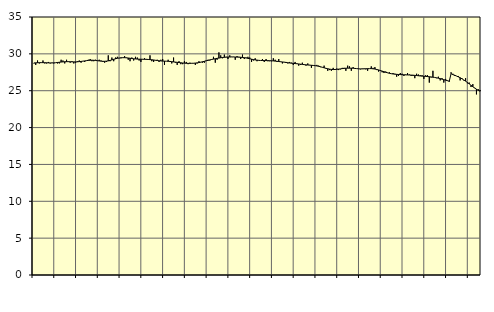
| Category | Piggar | Series 1 |
|---|---|---|
| nan | 28.7 | 28.77 |
| 1.0 | 28.5 | 28.78 |
| 1.0 | 29.1 | 28.8 |
| 1.0 | 28.7 | 28.8 |
| 1.0 | 28.8 | 28.81 |
| 1.0 | 29.1 | 28.81 |
| 1.0 | 28.7 | 28.8 |
| 1.0 | 28.7 | 28.79 |
| 1.0 | 28.9 | 28.78 |
| 1.0 | 28.7 | 28.77 |
| 1.0 | 28.8 | 28.77 |
| 1.0 | 28.7 | 28.78 |
| nan | 28.8 | 28.8 |
| 2.0 | 28.7 | 28.83 |
| 2.0 | 28.7 | 28.86 |
| 2.0 | 29.2 | 28.89 |
| 2.0 | 29.1 | 28.91 |
| 2.0 | 28.7 | 28.93 |
| 2.0 | 29.2 | 28.94 |
| 2.0 | 28.9 | 28.94 |
| 2.0 | 28.8 | 28.93 |
| 2.0 | 29 | 28.92 |
| 2.0 | 28.7 | 28.91 |
| 2.0 | 28.8 | 28.91 |
| nan | 29 | 28.92 |
| 3.0 | 29.1 | 28.95 |
| 3.0 | 28.8 | 28.97 |
| 3.0 | 29 | 29.01 |
| 3.0 | 28.9 | 29.04 |
| 3.0 | 29.1 | 29.08 |
| 3.0 | 29.2 | 29.11 |
| 3.0 | 29.3 | 29.13 |
| 3.0 | 29 | 29.14 |
| 3.0 | 29 | 29.13 |
| 3.0 | 29.2 | 29.11 |
| 3.0 | 29.1 | 29.07 |
| nan | 29.2 | 29.04 |
| 4.0 | 29.1 | 29.01 |
| 4.0 | 28.9 | 28.99 |
| 4.0 | 28.8 | 28.99 |
| 4.0 | 28.9 | 29.01 |
| 4.0 | 29.8 | 29.05 |
| 4.0 | 29 | 29.11 |
| 4.0 | 29.5 | 29.18 |
| 4.0 | 29 | 29.26 |
| 4.0 | 29.5 | 29.33 |
| 4.0 | 29.6 | 29.4 |
| 4.0 | 29.4 | 29.44 |
| nan | 29.4 | 29.47 |
| 5.0 | 29.5 | 29.48 |
| 5.0 | 29.7 | 29.48 |
| 5.0 | 29.5 | 29.46 |
| 5.0 | 29.2 | 29.44 |
| 5.0 | 29 | 29.4 |
| 5.0 | 29.5 | 29.37 |
| 5.0 | 29.1 | 29.33 |
| 5.0 | 29.6 | 29.31 |
| 5.0 | 29.5 | 29.29 |
| 5.0 | 29.1 | 29.28 |
| 5.0 | 28.9 | 29.27 |
| nan | 29.3 | 29.27 |
| 6.0 | 29.4 | 29.26 |
| 6.0 | 29.2 | 29.26 |
| 6.0 | 29.2 | 29.24 |
| 6.0 | 29.8 | 29.22 |
| 6.0 | 29 | 29.2 |
| 6.0 | 28.9 | 29.17 |
| 6.0 | 29.1 | 29.13 |
| 6.0 | 29.2 | 29.1 |
| 6.0 | 28.9 | 29.06 |
| 6.0 | 29.2 | 29.04 |
| 6.0 | 29.3 | 29.02 |
| nan | 28.5 | 29.01 |
| 7.0 | 29 | 29 |
| 7.0 | 29.2 | 28.99 |
| 7.0 | 28.9 | 28.97 |
| 7.0 | 28.7 | 28.94 |
| 7.0 | 29.5 | 28.91 |
| 7.0 | 28.8 | 28.88 |
| 7.0 | 28.5 | 28.85 |
| 7.0 | 29 | 28.82 |
| 7.0 | 28.6 | 28.79 |
| 7.0 | 28.6 | 28.76 |
| 7.0 | 29 | 28.74 |
| nan | 28.9 | 28.72 |
| 8.0 | 28.6 | 28.71 |
| 8.0 | 28.8 | 28.71 |
| 8.0 | 28.7 | 28.72 |
| 8.0 | 28.7 | 28.73 |
| 8.0 | 28.5 | 28.75 |
| 8.0 | 28.7 | 28.78 |
| 8.0 | 29 | 28.82 |
| 8.0 | 28.9 | 28.87 |
| 8.0 | 28.8 | 28.93 |
| 8.0 | 28.8 | 28.99 |
| 8.0 | 29.1 | 29.06 |
| nan | 29.2 | 29.12 |
| 9.0 | 29.1 | 29.18 |
| 9.0 | 29.2 | 29.24 |
| 9.0 | 29.6 | 29.29 |
| 9.0 | 28.8 | 29.34 |
| 9.0 | 29.2 | 29.39 |
| 9.0 | 30.2 | 29.43 |
| 9.0 | 29.8 | 29.47 |
| 9.0 | 29.4 | 29.51 |
| 9.0 | 29.9 | 29.53 |
| 9.0 | 29.6 | 29.55 |
| 9.0 | 29.3 | 29.57 |
| nan | 29.8 | 29.57 |
| 10.0 | 29.6 | 29.58 |
| 10.0 | 29.6 | 29.58 |
| 10.0 | 29.2 | 29.57 |
| 10.0 | 29.7 | 29.56 |
| 10.0 | 29.6 | 29.55 |
| 10.0 | 29.3 | 29.54 |
| 10.0 | 29.9 | 29.51 |
| 10.0 | 29.3 | 29.48 |
| 10.0 | 29.5 | 29.44 |
| 10.0 | 29.6 | 29.39 |
| 10.0 | 29.5 | 29.33 |
| nan | 28.9 | 29.28 |
| 11.0 | 29.1 | 29.22 |
| 11.0 | 29.4 | 29.18 |
| 11.0 | 29 | 29.15 |
| 11.0 | 29.1 | 29.12 |
| 11.0 | 29.1 | 29.1 |
| 11.0 | 29.3 | 29.1 |
| 11.0 | 28.9 | 29.09 |
| 11.0 | 29.3 | 29.09 |
| 11.0 | 29 | 29.08 |
| 11.0 | 29 | 29.07 |
| 11.0 | 29 | 29.06 |
| nan | 29.4 | 29.04 |
| 12.0 | 29.2 | 29.02 |
| 12.0 | 28.9 | 28.99 |
| 12.0 | 29.3 | 28.96 |
| 12.0 | 28.9 | 28.93 |
| 12.0 | 28.7 | 28.9 |
| 12.0 | 28.9 | 28.87 |
| 12.0 | 28.9 | 28.83 |
| 12.0 | 28.7 | 28.8 |
| 12.0 | 28.9 | 28.76 |
| 12.0 | 28.8 | 28.73 |
| 12.0 | 28.5 | 28.71 |
| nan | 28.9 | 28.68 |
| 13.0 | 28.7 | 28.66 |
| 13.0 | 28.4 | 28.63 |
| 13.0 | 28.5 | 28.6 |
| 13.0 | 28.8 | 28.57 |
| 13.0 | 28.5 | 28.54 |
| 13.0 | 28.4 | 28.51 |
| 13.0 | 28.7 | 28.49 |
| 13.0 | 28.5 | 28.47 |
| 13.0 | 28.1 | 28.45 |
| 13.0 | 28.4 | 28.43 |
| 13.0 | 28.4 | 28.4 |
| nan | 28.5 | 28.36 |
| 14.0 | 28.4 | 28.31 |
| 14.0 | 28.2 | 28.25 |
| 14.0 | 28.2 | 28.18 |
| 14.0 | 28.4 | 28.11 |
| 14.0 | 28 | 28.04 |
| 14.0 | 27.7 | 27.98 |
| 14.0 | 27.8 | 27.93 |
| 14.0 | 27.7 | 27.89 |
| 14.0 | 28.1 | 27.87 |
| 14.0 | 27.9 | 27.88 |
| 14.0 | 28 | 27.9 |
| nan | 27.8 | 27.93 |
| 15.0 | 27.9 | 27.96 |
| 15.0 | 28.1 | 28 |
| 15.0 | 28.1 | 28.03 |
| 15.0 | 27.7 | 28.05 |
| 15.0 | 28.4 | 28.06 |
| 15.0 | 28.3 | 28.06 |
| 15.0 | 27.7 | 28.06 |
| 15.0 | 28.2 | 28.05 |
| 15.0 | 28 | 28.02 |
| 15.0 | 28 | 28 |
| 15.0 | 28 | 27.97 |
| nan | 27.9 | 27.96 |
| 16.0 | 28 | 27.96 |
| 16.0 | 28 | 27.97 |
| 16.0 | 27.9 | 27.98 |
| 16.0 | 27.7 | 27.99 |
| 16.0 | 28 | 28 |
| 16.0 | 28.3 | 28 |
| 16.0 | 28.1 | 27.97 |
| 16.0 | 28.2 | 27.94 |
| 16.0 | 27.8 | 27.88 |
| 16.0 | 27.6 | 27.82 |
| 16.0 | 27.8 | 27.74 |
| nan | 27.5 | 27.66 |
| 17.0 | 27.4 | 27.58 |
| 17.0 | 27.6 | 27.5 |
| 17.0 | 27.4 | 27.43 |
| 17.0 | 27.5 | 27.36 |
| 17.0 | 27.3 | 27.31 |
| 17.0 | 27.4 | 27.27 |
| 17.0 | 27.3 | 27.24 |
| 17.0 | 26.9 | 27.22 |
| 17.0 | 27 | 27.2 |
| 17.0 | 27.4 | 27.19 |
| 17.0 | 27.3 | 27.17 |
| nan | 27 | 27.16 |
| 18.0 | 27.2 | 27.15 |
| 18.0 | 27.4 | 27.14 |
| 18.0 | 27.2 | 27.13 |
| 18.0 | 27 | 27.12 |
| 18.0 | 27 | 27.11 |
| 18.0 | 26.7 | 27.08 |
| 18.0 | 27.3 | 27.06 |
| 18.0 | 27.2 | 27.03 |
| 18.0 | 27.1 | 27 |
| 18.0 | 27.1 | 26.98 |
| 18.0 | 26.6 | 26.96 |
| nan | 27.1 | 26.94 |
| 19.0 | 27.1 | 26.92 |
| 19.0 | 26.1 | 26.9 |
| 19.0 | 26.8 | 26.87 |
| 19.0 | 27.7 | 26.83 |
| 19.0 | 26.8 | 26.8 |
| 19.0 | 26.7 | 26.75 |
| 19.0 | 26.9 | 26.7 |
| 19.0 | 26.4 | 26.64 |
| 19.0 | 26.7 | 26.57 |
| 19.0 | 26.1 | 26.5 |
| 19.0 | 26.6 | 26.43 |
| nan | 26.4 | 26.36 |
| 20.0 | 26.2 | 26.29 |
| 20.0 | 27.5 | 27.31 |
| 20.0 | 27.3 | 27.18 |
| 20.0 | 27 | 27.1 |
| 20.0 | 27 | 26.99 |
| 20.0 | 27 | 26.88 |
| 20.0 | 26.4 | 26.76 |
| 20.0 | 26.7 | 26.62 |
| 20.0 | 26.4 | 26.46 |
| 20.0 | 26.7 | 26.3 |
| 20.0 | 26 | 26.12 |
| nan | 26.1 | 25.93 |
| 21.0 | 25.5 | 25.73 |
| 21.0 | 25.9 | 25.54 |
| 21.0 | 25.4 | 25.36 |
| 21.0 | 24.5 | 25.2 |
| 21.0 | 25.2 | 25.05 |
| 21.0 | 25.1 | 24.93 |